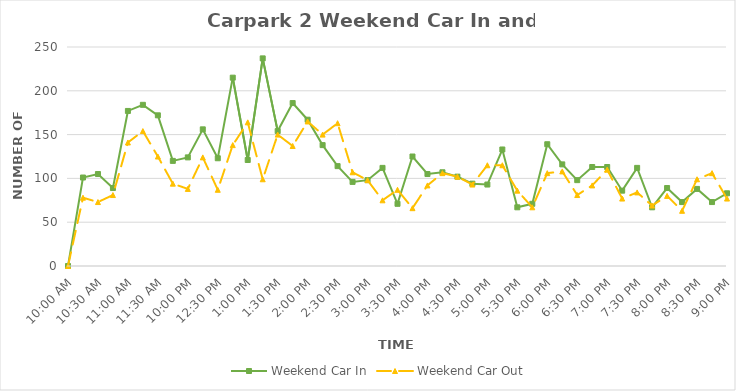
| Category | Weekend Car In | Weekend Car Out |
|---|---|---|
| 0.4166666666666667 | 0 | 0 |
| 0.4270833333333333 | 101 | 78 |
| 0.4375 | 105 | 73 |
| 0.4479166666666667 | 89 | 81 |
| 0.4583333333333333 | 177 | 141 |
| 0.46875 | 184 | 154 |
| 0.4791666666666667 | 172 | 125 |
| 0.4895833333333333 | 120 | 94 |
| 0.5 | 124 | 88 |
| 0.5104166666666666 | 156 | 124 |
| 0.5208333333333334 | 123 | 87 |
| 0.53125 | 215 | 138 |
| 0.5416666666666666 | 121 | 164 |
| 0.5520833333333334 | 237 | 99 |
| 0.5625 | 154 | 150 |
| 0.5729166666666666 | 186 | 137 |
| 0.5833333333333334 | 167 | 165 |
| 0.59375 | 138 | 150 |
| 0.604166666666667 | 114 | 163 |
| 0.614583333333334 | 96 | 107 |
| 0.625 | 98 | 98 |
| 0.635416666666667 | 112 | 75 |
| 0.645833333333334 | 71 | 87 |
| 0.656250000000001 | 125 | 66 |
| 0.666666666666667 | 105 | 92 |
| 0.677083333333334 | 107 | 106 |
| 0.687500000000001 | 102 | 102 |
| 0.697916666666668 | 94 | 93 |
| 0.708333333333335 | 93 | 115 |
| 0.718750000000002 | 133 | 115 |
| 0.729166666666669 | 67 | 86 |
| 0.739583333333336 | 71 | 67 |
| 0.75 | 139 | 106 |
| 0.7604166666666666 | 116 | 108 |
| 0.7708333333333334 | 98 | 81 |
| 0.78125 | 113 | 92 |
| 0.7916666666666666 | 113 | 110 |
| 0.8020833333333334 | 86 | 77 |
| 0.8125 | 112 | 84 |
| 0.8229166666666666 | 67 | 69 |
| 0.8333333333333334 | 89 | 80 |
| 0.84375 | 73 | 63 |
| 0.8541666666666666 | 88 | 99 |
| 0.8645833333333334 | 73 | 106 |
| 0.875 | 83 | 77 |